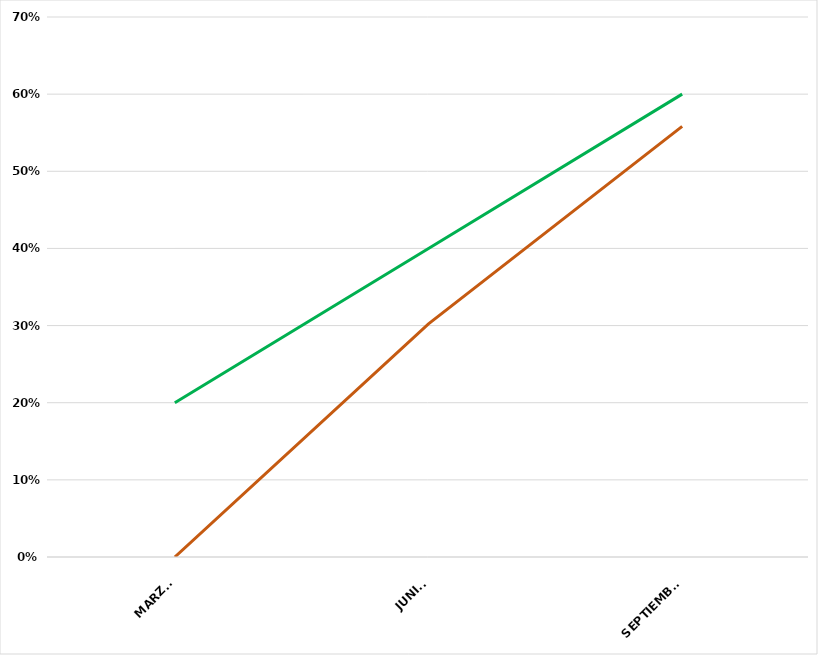
| Category | VALOR  | META PONDERADA |
|---|---|---|
| MARZO | 0 | 0.2 |
| JUNIO | 0.302 | 0.4 |
| SEPTIEMBRE | 0.558 | 0.6 |